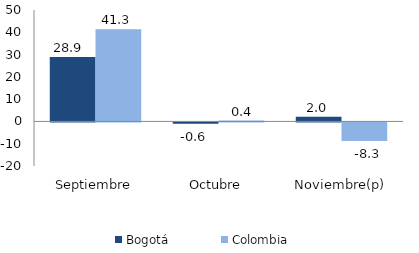
| Category | Bogotá | Colombia |
|---|---|---|
| Septiembre | 28.926 | 41.331 |
| Octubre | -0.642 | 0.376 |
| Noviembre(p) | 2.044 | -8.296 |